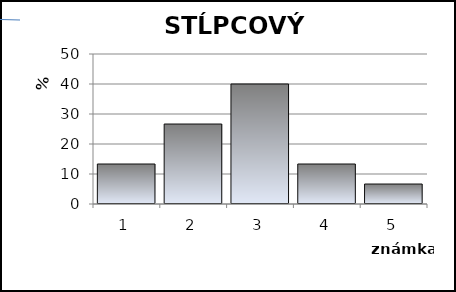
| Category | Časť žiakov v % |
|---|---|
| 0 | 13.33 |
| 1 | 26.66 |
| 2 | 40 |
| 3 | 13.33 |
| 4 | 6.66 |